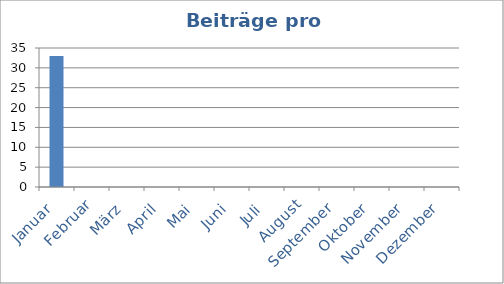
| Category | Beiträge |
|---|---|
| Januar | 33 |
| Februar | 0 |
| März | 0 |
| April | 0 |
| Mai | 0 |
| Juni | 0 |
| Juli | 0 |
| August | 0 |
| September | 0 |
| Oktober | 0 |
| November | 0 |
| Dezember | 0 |